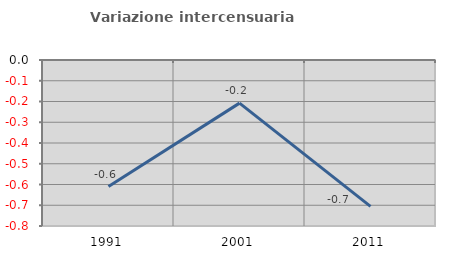
| Category | Variazione intercensuaria annua |
|---|---|
| 1991.0 | -0.61 |
| 2001.0 | -0.208 |
| 2011.0 | -0.705 |